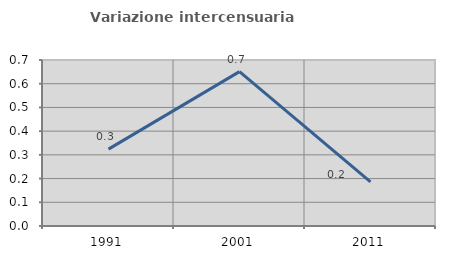
| Category | Variazione intercensuaria annua |
|---|---|
| 1991.0 | 0.324 |
| 2001.0 | 0.651 |
| 2011.0 | 0.186 |